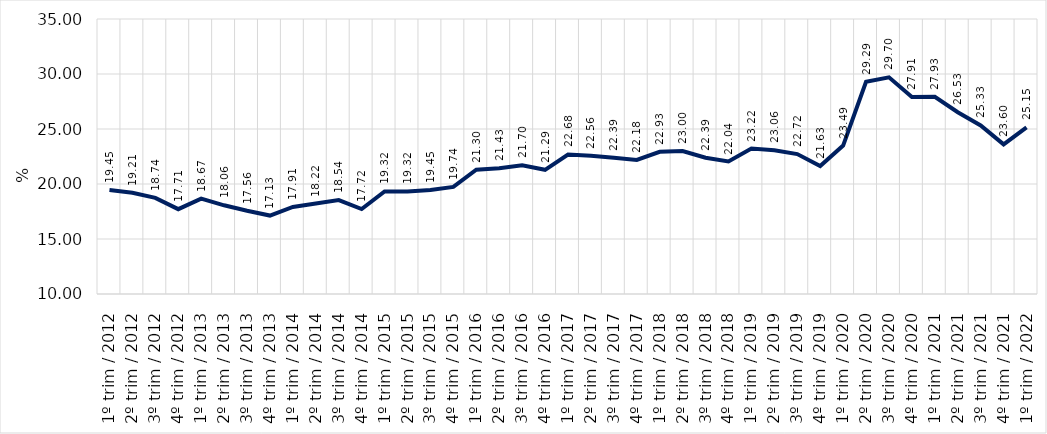
| Category | Series 0 |
|---|---|
| 1º trim / 2012 | 19.45 |
| 2º trim / 2012 | 19.207 |
| 3º trim / 2012 | 18.737 |
| 4º trim / 2012 | 17.712 |
| 1º trim / 2013 | 18.675 |
| 2º trim / 2013 | 18.062 |
| 3º trim / 2013 | 17.565 |
| 4º trim / 2013 | 17.129 |
| 1º trim / 2014 | 17.91 |
| 2º trim / 2014 | 18.224 |
| 3º trim / 2014 | 18.544 |
| 4º trim / 2014 | 17.723 |
| 1º trim / 2015 | 19.318 |
| 2º trim / 2015 | 19.32 |
| 3º trim / 2015 | 19.454 |
| 4º trim / 2015 | 19.74 |
| 1º trim / 2016 | 21.296 |
| 2º trim / 2016 | 21.43 |
| 3º trim / 2016 | 21.702 |
| 4º trim / 2016 | 21.291 |
| 1º trim / 2017 | 22.684 |
| 2º trim / 2017 | 22.559 |
| 3º trim / 2017 | 22.39 |
| 4º trim / 2017 | 22.184 |
| 1º trim / 2018 | 22.932 |
| 2º trim / 2018 | 22.999 |
| 3º trim / 2018 | 22.387 |
| 4º trim / 2018 | 22.043 |
| 1º trim / 2019 | 23.222 |
| 2º trim / 2019 | 23.06 |
| 3º trim / 2019 | 22.722 |
| 4º trim / 2019 | 21.633 |
| 1º trim / 2020 | 23.494 |
| 2º trim / 2020 | 29.29 |
| 3º trim / 2020 | 29.701 |
| 4º trim / 2020 | 27.909 |
| 1º trim / 2021 | 27.932 |
| 2º trim / 2021 | 26.527 |
| 3º trim / 2021 | 25.328 |
| 4º trim / 2021 | 23.599 |
| 1º trim / 2022 | 25.152 |